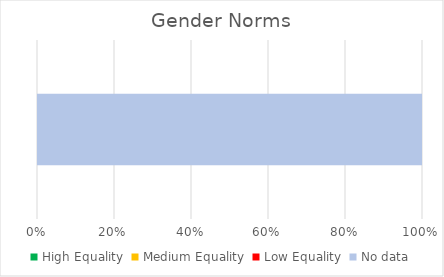
| Category | High Equality | Medium Equality | Low Equality | No data |
|---|---|---|---|---|
| 0 | 0 | 0 | 0 | 4 |